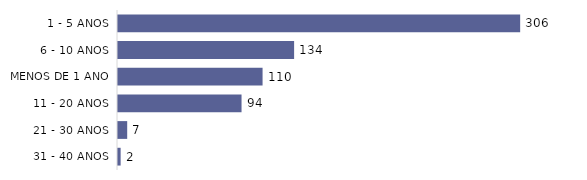
| Category | Total |
|---|---|
| 1 - 5 ANOS | 306 |
| 6 - 10 ANOS | 134 |
| MENOS DE 1 ANO | 110 |
| 11 - 20 ANOS | 94 |
| 21 - 30 ANOS | 7 |
| 31 - 40 ANOS | 2 |